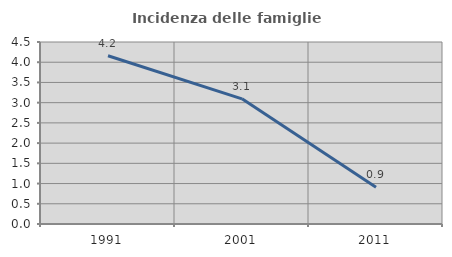
| Category | Incidenza delle famiglie numerose |
|---|---|
| 1991.0 | 4.16 |
| 2001.0 | 3.094 |
| 2011.0 | 0.908 |